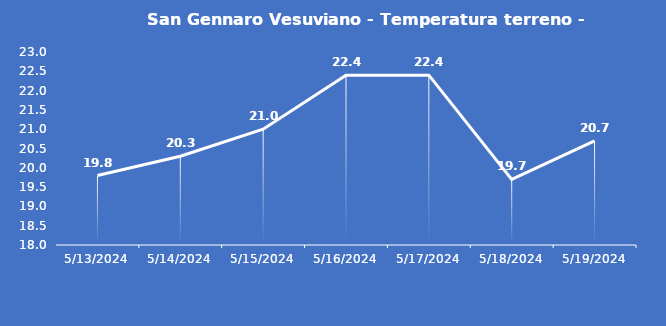
| Category | San Gennaro Vesuviano - Temperatura terreno - Grezzo (°C) |
|---|---|
| 5/13/24 | 19.8 |
| 5/14/24 | 20.3 |
| 5/15/24 | 21 |
| 5/16/24 | 22.4 |
| 5/17/24 | 22.4 |
| 5/18/24 | 19.7 |
| 5/19/24 | 20.7 |